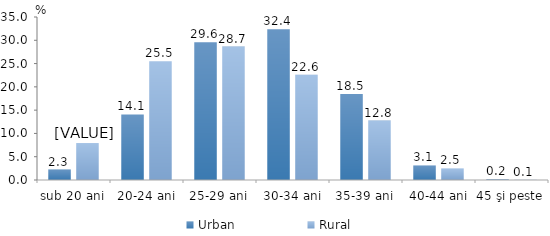
| Category | Urban | Rural |
|---|---|---|
| sub 20 ani | 2.251 | 7.937 |
| 20-24 ani | 14.078 | 25.5 |
| 25-29 ani | 29.555 | 28.658 |
| 30-34 ani | 32.362 | 22.582 |
| 35-39 ani | 18.472 | 12.766 |
| 40-44 ani | 3.129 | 2.5 |
| 45 şi peste | 0.152 | 0.057 |